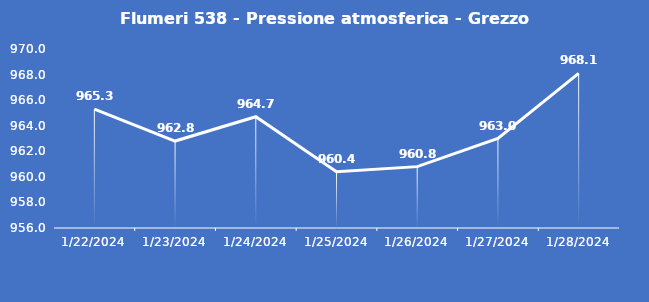
| Category | Flumeri 538 - Pressione atmosferica - Grezzo (hPa) |
|---|---|
| 1/22/24 | 965.3 |
| 1/23/24 | 962.8 |
| 1/24/24 | 964.7 |
| 1/25/24 | 960.4 |
| 1/26/24 | 960.8 |
| 1/27/24 | 963 |
| 1/28/24 | 968.1 |